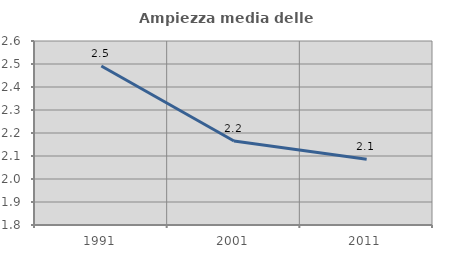
| Category | Ampiezza media delle famiglie |
|---|---|
| 1991.0 | 2.491 |
| 2001.0 | 2.165 |
| 2011.0 | 2.086 |